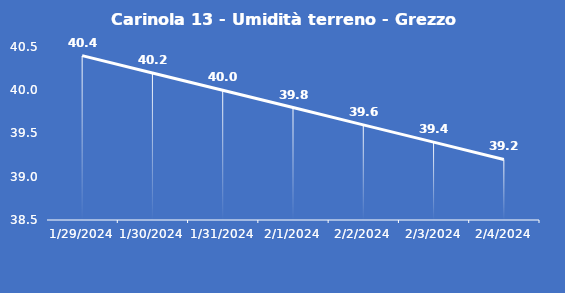
| Category | Carinola 13 - Umidità terreno - Grezzo (%VWC) |
|---|---|
| 1/29/24 | 40.4 |
| 1/30/24 | 40.2 |
| 1/31/24 | 40 |
| 2/1/24 | 39.8 |
| 2/2/24 | 39.6 |
| 2/3/24 | 39.4 |
| 2/4/24 | 39.2 |